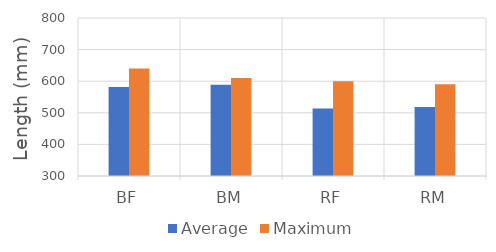
| Category | Average | Maximum |
|---|---|---|
| BF | 582 | 640 |
| BM | 589 | 610 |
| RF | 514 | 600 |
| RM | 518 | 590 |